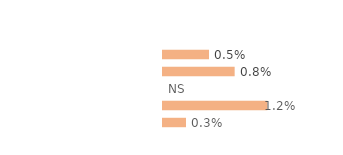
| Category | Series 0 |
|---|---|
| Personnes en emploi¹ | 0.005 |
| Chômeuses | 0.008 |
| Retraitées | 0 |
| Étudiantes, élèves | 0.012 |
| Autres inactifs  | 0.003 |